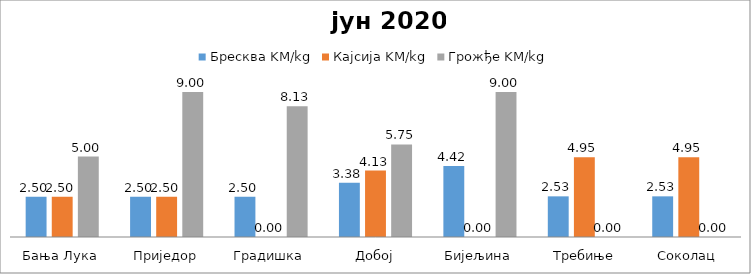
| Category | Бресква KM/kg | Кајсија KM/kg | Грожђе KM/kg |
|---|---|---|---|
| Бања Лука | 2.5 | 2.5 | 5 |
| Приједор | 2.5 | 2.5 | 9 |
| Градишка | 2.5 | 0 | 8.125 |
| Добој | 3.375 | 4.125 | 5.75 |
| Бијељина | 4.417 | 0 | 9 |
|  Требиње | 2.525 | 4.95 | 0 |
| Соколац | 2.525 | 4.95 | 0 |